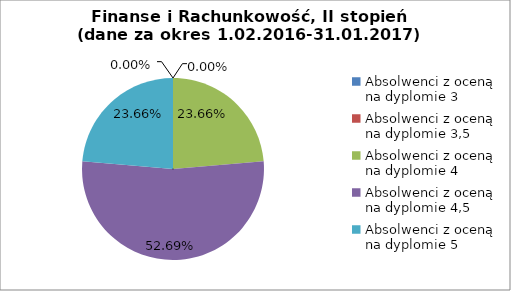
| Category | Series 0 |
|---|---|
| Absolwenci z oceną na dyplomie 3 | 0 |
| Absolwenci z oceną na dyplomie 3,5 | 0 |
| Absolwenci z oceną na dyplomie 4 | 23.656 |
| Absolwenci z oceną na dyplomie 4,5 | 52.688 |
| Absolwenci z oceną na dyplomie 5 | 23.656 |